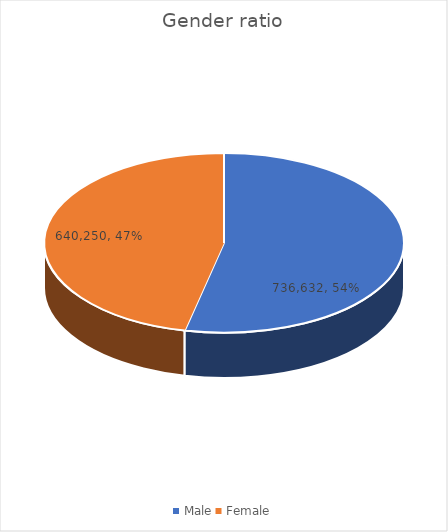
| Category | Series 0 |
|---|---|
| Male | 736631.87 |
| Female | 640250.13 |